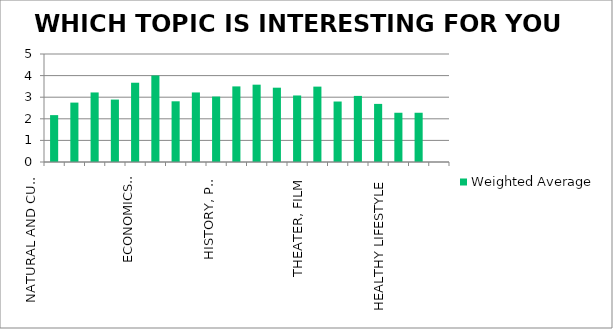
| Category | Weighted Average |
|---|---|
| NATURAL AND CULTURAL MONUMENTS WITH EXCURSION | 2.17 |
| GEOGRAPHY | 2.75 |
| LETERATURE | 3.22 |
| MEDICINE, HEALTH, SECURITY | 2.89 |
| ECONOMICS, FINANCE | 3.67 |
| PHYSICS, MATHEMATICS AND OTHER | 4 |
| PSYCHOLOGY, SOCIOLOGY AND OTHER SOCIAL SCIENCES | 2.81 |
| FINE ART, MUSIC, ARTS AND CRAFTS | 3.22 |
| HISTORY, PHILOSOPHY | 3.03 |
| INFORMATION TECHNOLOGY, COMPUTERS, INTERNET, SMART PHONES | 3.5 |
| MEDIA AND COMMUNICATION | 3.58 |
| SPORT, GAMES, RECREATION, DANCE | 3.44 |
| THEATER, FILM | 3.08 |
| POLITICS AND LAW | 3.49 |
| LANGUAGES | 2.8 |
| ENVIRONMENT | 3.06 |
| HEALTHY LIFESTYLE | 2.69 |
| AGRICULTURE, GARDENING, ANIMAL CARE | 2.28 |
| MEMORY TRAINING | 2.28 |
| OTHERS: | 0 |